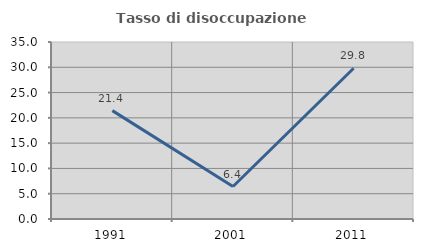
| Category | Tasso di disoccupazione giovanile  |
|---|---|
| 1991.0 | 21.429 |
| 2001.0 | 6.422 |
| 2011.0 | 29.808 |